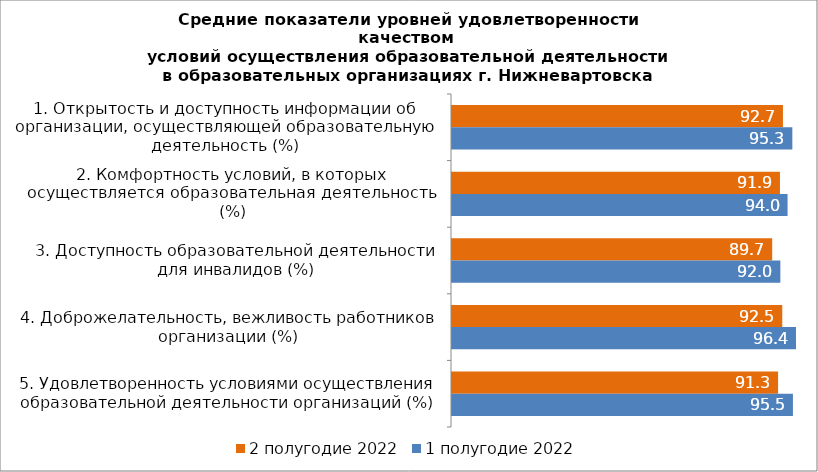
| Category | 2 полугодие 2022 | 1 полугодие 2022 |
|---|---|---|
| 1. Открытость и доступность информации об организации, осуществляющей образовательную деятельность (%) | 92.699 | 95.335 |
| 2. Комфортность условий, в которых осуществляется образовательная деятельность (%) | 91.864 | 93.995 |
| 3. Доступность образовательной деятельности для инвалидов (%) | 89.69 | 91.978 |
| 4. Доброжелательность, вежливость работников организации (%) | 92.511 | 96.355 |
| 5. Удовлетворенность условиями осуществления образовательной деятельности организаций (%) | 91.339 | 95.498 |